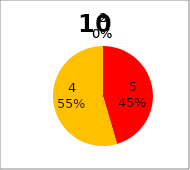
| Category | Series 0 |
|---|---|
| 5.0 | 5 |
| 4.0 | 6 |
| 3.0 | 0 |
| 2.0 | 0 |